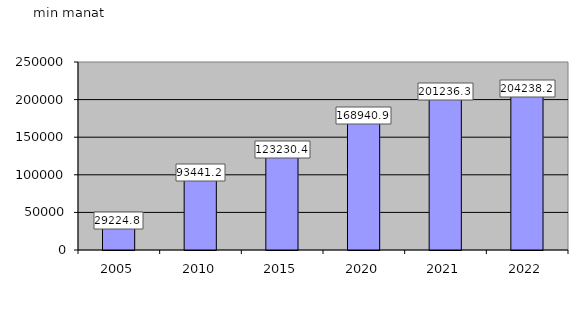
| Category | Series 0 |
|---|---|
| 2005.0 | 29224.8 |
| 2010.0 | 93441.2 |
| 2015.0 | 123230.4 |
| 2020.0 | 168940.9 |
| 2021.0 | 201236.3 |
| 2022.0 | 204238.2 |